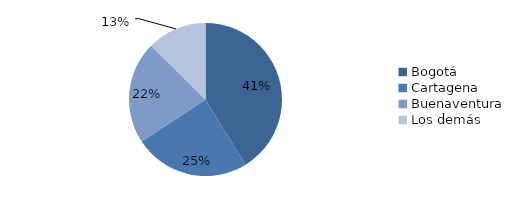
| Category | Series 0 |
|---|---|
| Bogotá | 1066.763 |
| Cartagena | 633.856 |
| Buenaventura | 560.512 |
| Los demás | 326.154 |